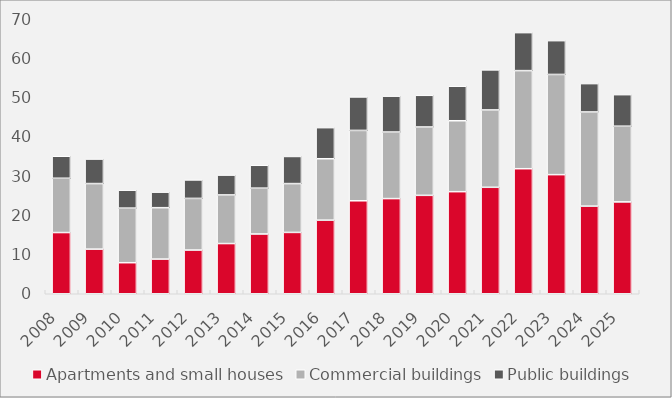
| Category | Apartments and small houses | Commercial buildings | Public buildings |
|---|---|---|---|
| 2008.0 | 15.582 | 13.815 | 5.602 |
| 2009.0 | 11.362 | 16.687 | 6.238 |
| 2010.0 | 7.906 | 13.892 | 4.557 |
| 2011.0 | 8.828 | 13.081 | 3.953 |
| 2012.0 | 11.128 | 13.142 | 4.699 |
| 2013.0 | 12.776 | 12.379 | 5.048 |
| 2014.0 | 15.214 | 11.664 | 5.825 |
| 2015.0 | 15.612 | 12.431 | 6.905 |
| 2016.0 | 18.736 | 15.628 | 7.918 |
| 2017.0 | 23.665 | 17.912 | 8.518 |
| 2018.0 | 24.225 | 16.942 | 9.126 |
| 2019.0 | 25.052 | 17.401 | 8.061 |
| 2020.0 | 25.986 | 18.054 | 8.78 |
| 2021.0 | 27.1 | 19.691 | 10.19 |
| 2022.0 | 31.827 | 24.972 | 9.671 |
| 2023.0 | 30.323 | 25.499 | 8.605 |
| 2024.0 | 22.304 | 23.969 | 7.22 |
| 2025.0 | 23.386 | 19.264 | 8.029 |